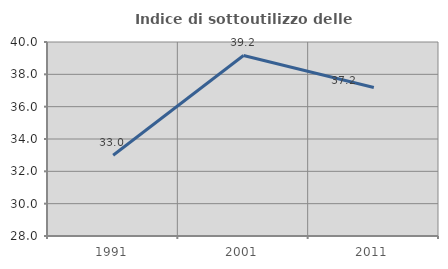
| Category | Indice di sottoutilizzo delle abitazioni  |
|---|---|
| 1991.0 | 32.997 |
| 2001.0 | 39.166 |
| 2011.0 | 37.19 |